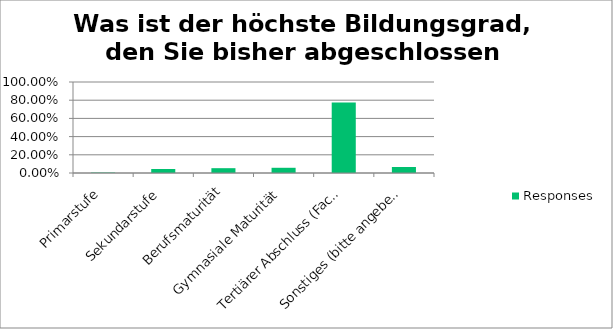
| Category | Responses |
|---|---|
| Primarstufe | 0.004 |
| Sekundarstufe | 0.044 |
| Berufsmaturität | 0.053 |
| Gymnasiale Maturität | 0.057 |
| Tertiärer Abschluss (Fachdiplom, Höhere Fachhochschule, Fachhochschule, Hochschule) | 0.775 |
| Sonstiges (bitte angeben) | 0.066 |